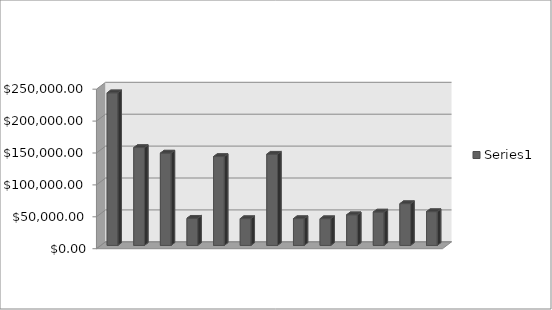
| Category | Series 0 |
|---|---|
| 0 | 239057.725 |
| 1 | 153240.88 |
| 2 | 144609.92 |
| 3 | 42505.95 |
| 4 | 139190.37 |
| 5 | 41879.76 |
| 6 | 142877.595 |
| 7 | 41901.6 |
| 8 | 41771.6 |
| 9 | 47947.64 |
| 10 | 52241.28 |
| 11 | 65418.44 |
| 12 | 52862.885 |